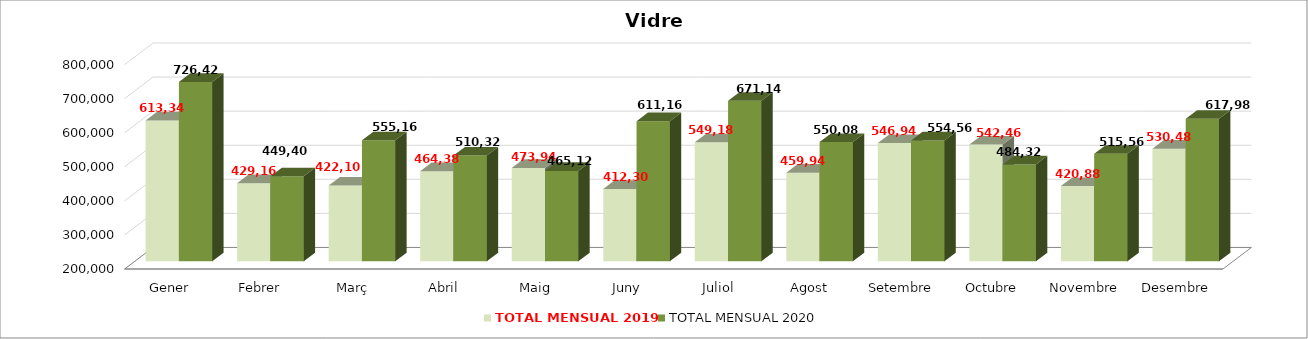
| Category | TOTAL MENSUAL 2019 | TOTAL MENSUAL 2020 |
|---|---|---|
| Gener | 613339.87 | 726420 |
| Febrer | 429160.02 | 449399.99 |
| Març | 422100 | 555160 |
| Abril | 464379.99 | 510319.99 |
| Maig | 473939.96 | 465120.02 |
| Juny | 412300 | 611160.01 |
| Juliol | 549179.97 | 671139.98 |
| Agost | 459940.02 | 550080 |
| Setembre | 546939.99 | 554559.99 |
| Octubre | 542460.1 | 484320.02 |
| Novembre | 420880 | 515559.99 |
| Desembre | 530479.97 | 617980.03 |